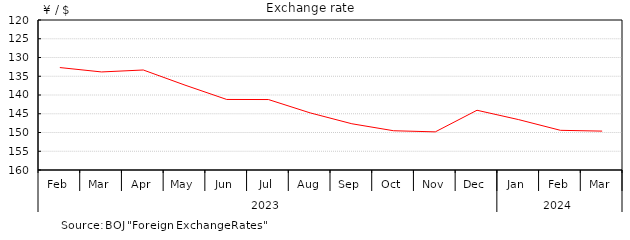
| Category | Series 0 |
|---|---|
| 0 | 132.68 |
| 1 | 133.85 |
| 2 | 133.33 |
| 3 | 137.37 |
| 4 | 141.19 |
| 5 | 141.21 |
| 6 | 144.77 |
| 7 | 147.67 |
| 8 | 149.53 |
| 9 | 149.83 |
| 10 | 144.07 |
| 11 | 146.57 |
| 12 | 149.42 |
| 13 | 149.63 |